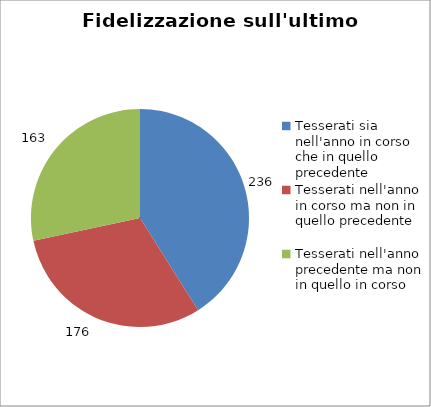
| Category | Nr. Tesserati |
|---|---|
| Tesserati sia nell'anno in corso che in quello precedente | 236 |
| Tesserati nell'anno in corso ma non in quello precedente | 176 |
| Tesserati nell'anno precedente ma non in quello in corso | 163 |